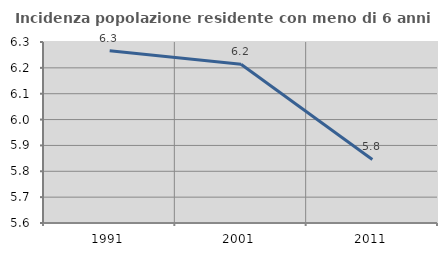
| Category | Incidenza popolazione residente con meno di 6 anni |
|---|---|
| 1991.0 | 6.267 |
| 2001.0 | 6.214 |
| 2011.0 | 5.846 |